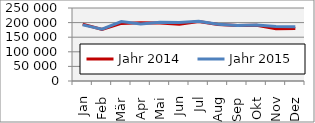
| Category | Jahr 2014 | Jahr 2015 |
|---|---|---|
| Jan | 194791.082 | 192114.802 |
| Feb | 176598.989 | 177299.627 |
| Mär | 197177.609 | 203597.141 |
| Apr | 199548.159 | 195339.567 |
| Mai | 198962.314 | 200957.766 |
| Jun | 194776.055 | 200533.611 |
| Jul | 203840.376 | 204231.597 |
| Aug | 193186.025 | 194006.388 |
| Sep | 190063.541 | 189968.715 |
| Okt | 190712.739 | 191679.674 |
| Nov | 178835.817 | 186723.305 |
| Dez | 179600.136 | 185870.633 |